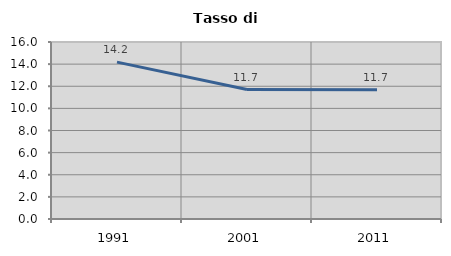
| Category | Tasso di disoccupazione   |
|---|---|
| 1991.0 | 14.181 |
| 2001.0 | 11.703 |
| 2011.0 | 11.681 |